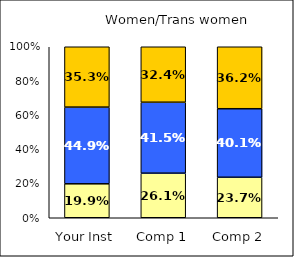
| Category | Low Institutional Priority: Civic Engagement | Average Institutional Priority: Civic Engagement | High Institutional Priority: Civic Engagement |
|---|---|---|---|
| Your Inst | 0.199 | 0.449 | 0.353 |
| Comp 1 | 0.261 | 0.415 | 0.324 |
| Comp 2 | 0.237 | 0.401 | 0.362 |